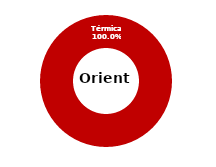
| Category | Oriente |
|---|---|
| Eólica | 0 |
| Hidráulica | 0 |
| Solar | 0 |
| Térmica | 51.7 |